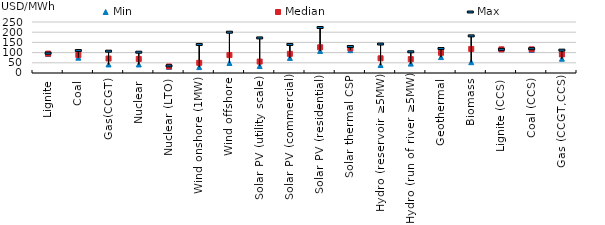
| Category | Min | Median | Max |
|---|---|---|---|
| Lignite | 93 | 95 | 97 |
| Coal | 75 | 88 | 110 |
| Gas(CCGT) | 42 | 71 | 107 |
| Nuclear | 42 | 69 | 102 |
| Nuclear (LTO) | 30 | 32 | 35 |
| Wind onshore (1MW) | 29 | 50 | 140 |
| Wind offshore | 49 | 88 | 200 |
| Solar PV (utility scale) | 34 | 56 | 172 |
| Solar PV (commercial) | 74 | 94 | 140 |
| Solar PV (residential) | 108 | 126 | 223 |
| Solar thermal CSP | 112 | 121 | 130 |
| Hydro (reservoir ≥5MW) | 39 | 72 | 142 |
| Hydro (run of river ≥5MW) | 46 | 68 | 104 |
| Geothermal | 78 | 99 | 120 |
| Biomass | 53 | 118 | 182 |
| Lignite (CCS) | 116 | 116 | 116 |
| Coal (CCS) | 113 | 116 | 119 |
| Gas (CCGT,CCS) | 70 | 91 | 112 |